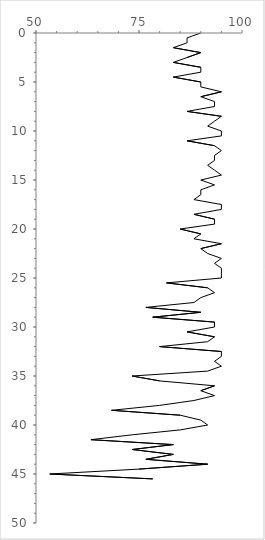
| Category | Series 0 |
|---|---|
| 90.0 | 0 |
| 86.66666666666667 | 0.5 |
| 86.66666666666667 | 1 |
| 83.33333333333334 | 1.5 |
| 90.0 | 2 |
| 86.66666666666667 | 2.5 |
| 83.33333333333334 | 3 |
| 90.0 | 3.5 |
| 90.0 | 4 |
| 83.33333333333334 | 4.5 |
| 90.0 | 5 |
| 90.0 | 5.5 |
| 95.0 | 6 |
| 90.0 | 6.5 |
| 93.33333333333333 | 7 |
| 93.33333333333333 | 7.5 |
| 86.66666666666667 | 8 |
| 95.0 | 8.5 |
| 93.33333333333333 | 9 |
| 91.66666666666667 | 9.5 |
| 95.0 | 10 |
| 95.0 | 10.5 |
| 86.66666666666667 | 11 |
| 93.33333333333333 | 11.5 |
| 95.0 | 12 |
| 93.33333333333333 | 12.5 |
| 93.33333333333333 | 13 |
| 91.66666666666667 | 13.5 |
| 93.33333333333333 | 14 |
| 95.0 | 14.5 |
| 90.0 | 15 |
| 93.33333333333333 | 15.5 |
| 90.0 | 16 |
| 90.0 | 16.5 |
| 88.33333333333333 | 17 |
| 95.0 | 17.5 |
| 95.0 | 18 |
| 88.33333333333333 | 18.5 |
| 93.33333333333333 | 19 |
| 93.33333333333333 | 19.5 |
| 85.0 | 20 |
| 90.0 | 20.5 |
| 88.33333333333333 | 21 |
| 95.0 | 21.5 |
| 90.0 | 22 |
| 91.66666666666667 | 22.5 |
| 95.0 | 23 |
| 93.33333333333333 | 23.5 |
| 95.0 | 24 |
| 95.0 | 24.5 |
| 95.0 | 25 |
| 81.66666666666666 | 25.5 |
| 91.66666666666667 | 26 |
| 93.33333333333333 | 26.5 |
| 90.0 | 27 |
| 88.33333333333333 | 27.5 |
| 76.66666666666667 | 28 |
| 90.0 | 28.5 |
| 78.33333333333333 | 29 |
| 93.33333333333333 | 29.5 |
| 93.33333333333333 | 30 |
| 86.66666666666667 | 30.5 |
| 93.33333333333333 | 31 |
| 91.66666666666667 | 31.5 |
| 80.0 | 32 |
| 95.0 | 32.5 |
| 95.0 | 33 |
| 93.33333333333333 | 33.5 |
| 95.0 | 34 |
| 91.66666666666667 | 34.5 |
| 73.33333333333333 | 35 |
| 80.0 | 35.5 |
| 93.33333333333333 | 36 |
| 90.0 | 36.5 |
| 93.33333333333333 | 37 |
| 88.33333333333333 | 37.5 |
| 80.0 | 38 |
| 68.33333333333333 | 38.5 |
| 85.0 | 39 |
| 90.0 | 39.5 |
| 91.66666666666667 | 40 |
| 85.0 | 40.5 |
| 73.33333333333333 | 41 |
| 63.33333333333333 | 41.5 |
| 83.33333333333334 | 42 |
| 73.33333333333333 | 42.5 |
| 83.33333333333334 | 43 |
| 76.66666666666667 | 43.5 |
| 91.66666666666667 | 44 |
| 75.0 | 44.5 |
| 53.333333333333336 | 45 |
| 78.33333333333333 | 45.5 |